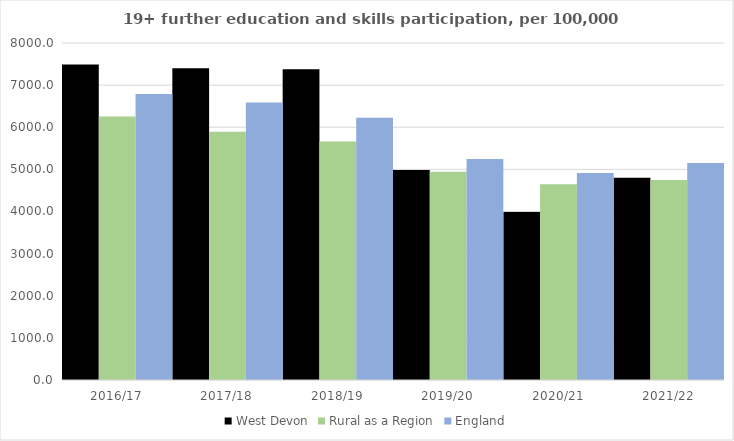
| Category | West Devon | Rural as a Region | England |
|---|---|---|---|
| 2016/17 | 7490 | 6253.401 | 6788 |
| 2017/18 | 7403 | 5892.029 | 6588 |
| 2018/19 | 7374 | 5661.873 | 6227 |
| 2019/20 | 4986 | 4943.801 | 5244 |
| 2020/21 | 3988 | 4646.727 | 4913 |
| 2021/22 | 4802 | 4747.049 | 5151 |